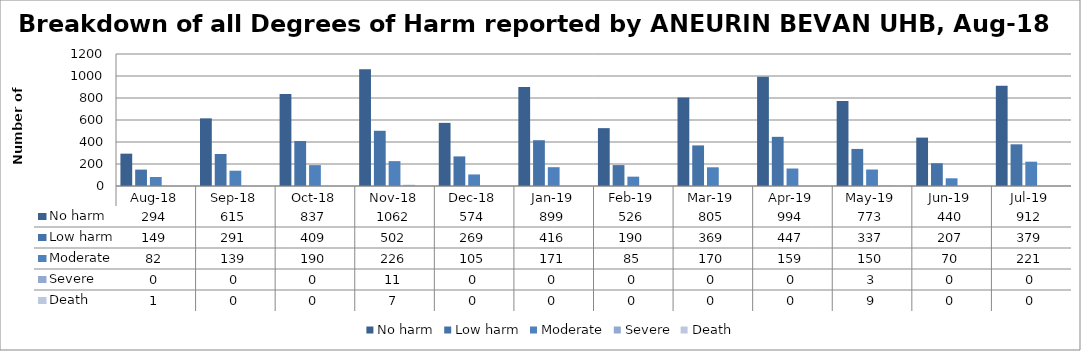
| Category | No harm | Low harm | Moderate | Severe | Death |
|---|---|---|---|---|---|
| Aug-18 | 294 | 149 | 82 | 0 | 1 |
| Sep-18 | 615 | 291 | 139 | 0 | 0 |
| Oct-18 | 837 | 409 | 190 | 0 | 0 |
| Nov-18 | 1062 | 502 | 226 | 11 | 7 |
| Dec-18 | 574 | 269 | 105 | 0 | 0 |
| Jan-19 | 899 | 416 | 171 | 0 | 0 |
| Feb-19 | 526 | 190 | 85 | 0 | 0 |
| Mar-19 | 805 | 369 | 170 | 0 | 0 |
| Apr-19 | 994 | 447 | 159 | 0 | 0 |
| May-19 | 773 | 337 | 150 | 3 | 9 |
| Jun-19 | 440 | 207 | 70 | 0 | 0 |
| Jul-19 | 912 | 379 | 221 | 0 | 0 |